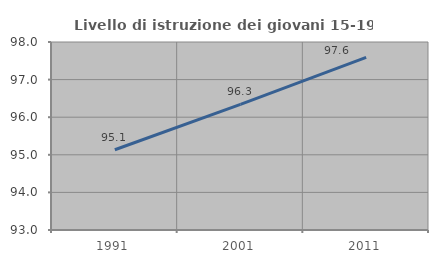
| Category | Livello di istruzione dei giovani 15-19 anni |
|---|---|
| 1991.0 | 95.133 |
| 2001.0 | 96.341 |
| 2011.0 | 97.593 |